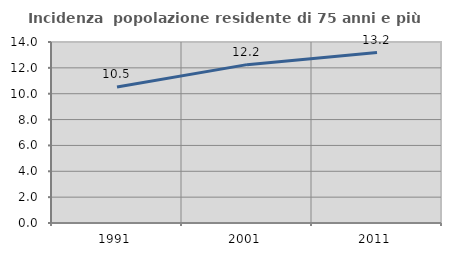
| Category | Incidenza  popolazione residente di 75 anni e più |
|---|---|
| 1991.0 | 10.523 |
| 2001.0 | 12.249 |
| 2011.0 | 13.181 |